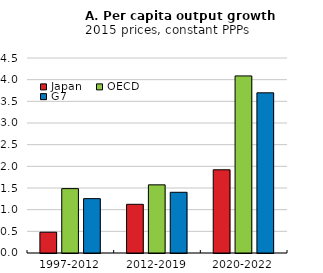
| Category | Japan | OECD | G7 |
|---|---|---|---|
| 1997-2012 | 0.48 | 1.486 | 1.255 |
| 2012-2019 | 1.124 | 1.573 | 1.401 |
| 2020-2022 | 1.92 | 4.086 | 3.696 |